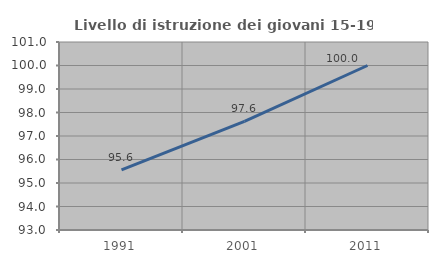
| Category | Livello di istruzione dei giovani 15-19 anni |
|---|---|
| 1991.0 | 95.556 |
| 2001.0 | 97.619 |
| 2011.0 | 100 |